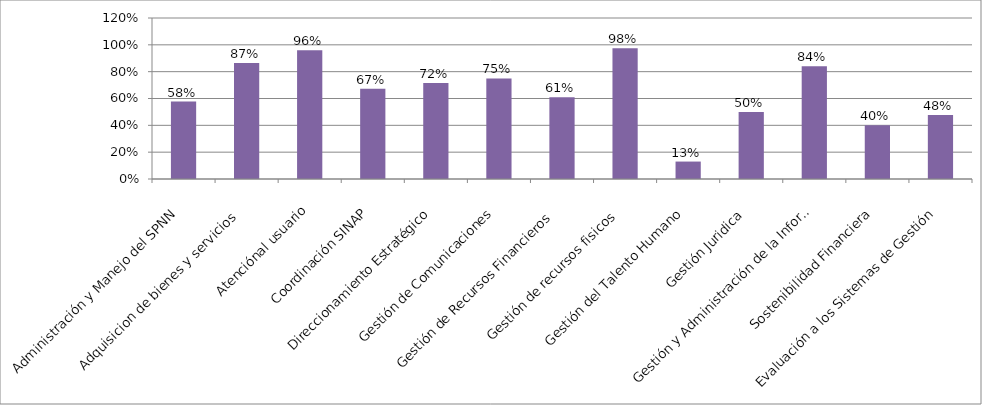
| Category | Series 0 |
|---|---|
| Administración y Manejo del SPNN | 0.577 |
| Adquisicion de bienes y servicios  | 0.865 |
| Atenciónal usuario | 0.96 |
| Coordinación SINAP | 0.672 |
| Direccionamiento Estratégico | 0.716 |
| Gestión de Comunicaciones | 0.75 |
| Gestión de Recursos Financieros  | 0.61 |
| Gestión de recursos fisicos  | 0.975 |
| Gestión del Talento Humano | 0.13 |
| Gestión Juridica  | 0.5 |
| Gestión y Administración de la Información  | 0.84 |
| Sostenibilidad Financiera | 0.4 |
| Evaluación a los Sistemas de Gestión  | 0.477 |